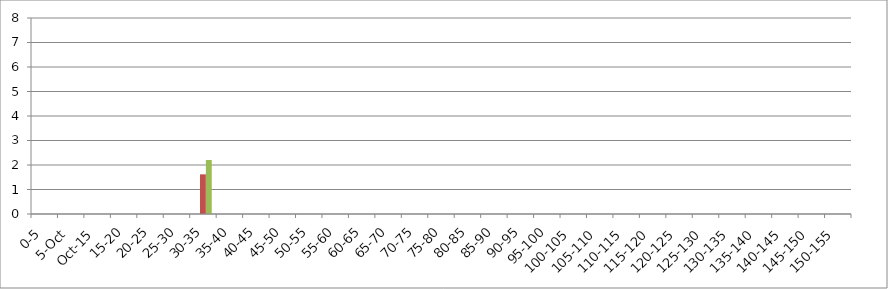
| Category | 119875 | 146067 | 241240 |
|---|---|---|---|
| 0-5 | 0 | 0 | 0 |
| 5-Oct | 0 | 0 | 0 |
| Oct-15 | 0 | 0 | 0 |
| 15-20 | 0 | 0 | 0 |
| 20-25 | 0 | 0 | 0 |
| 25-30 | 0 | 0 | 0 |
| 30-35 | 0 | 1.619 | 2.204 |
| 35-40 | 0 | 0 | 0 |
| 40-45 | 0 | 0 | 0 |
| 45-50 | 0 | 0 | 0 |
| 50-55 | 0 | 0 | 0 |
| 55-60 | 0 | 0 | 0 |
| 60-65 | 0 | 0 | 0 |
| 65-70 | 0 | 0 | 0 |
| 70-75 | 0 | 0 | 0 |
| 75-80 | 0 | 0 | 0 |
| 80-85 | 0 | 0 | 0 |
| 85-90 | 0 | 0 | 0 |
| 90-95 | 0 | 0 | 0 |
| 95-100 | 0 | 0 | 0 |
| 100-105 | 0 | 0 | 0 |
| 105-110 | 0 | 0 | 0 |
| 110-115 | 0 | 0 | 0 |
| 115-120 | 0 | 0 | 0 |
| 120-125 | 0 | 0 | 0 |
| 125-130 | 0 | 0 | 0 |
| 130-135 | 0 | 0 | 0 |
| 135-140 | 0 | 0 | 0 |
| 140-145 | 0 | 0 | 0 |
| 145-150 | 0 | 0 | 0 |
| 150-155 | 0 | 0 | 0 |